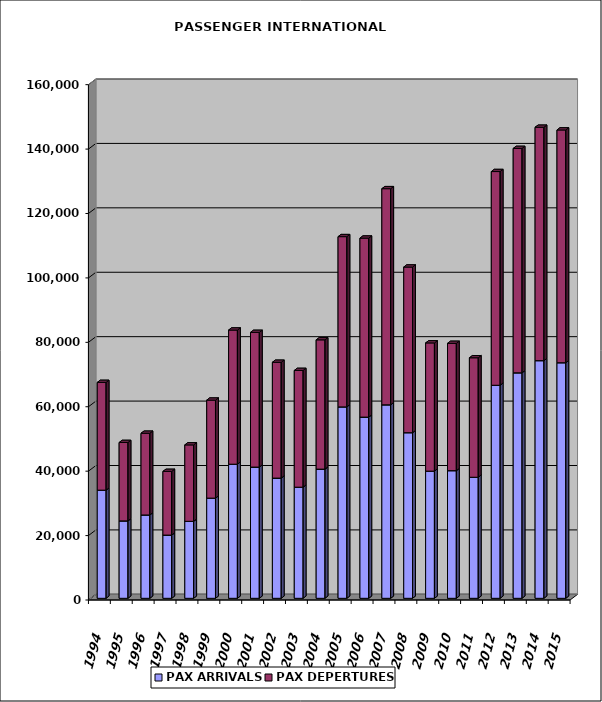
| Category | PAX ARRIVALS | PAX DEPERTURES |
|---|---|---|
| 1994.0 | 33577 | 33453 |
| 1995.0 | 24031 | 24351 |
| 1996.0 | 25874 | 25369 |
| 1997.0 | 19627 | 19773 |
| 1998.0 | 23902 | 23726 |
| 1999.0 | 31098 | 30429 |
| 2000.0 | 41635 | 41647 |
| 2001.0 | 40745 | 41813 |
| 2002.0 | 37317 | 35961 |
| 2003.0 | 34499 | 36246 |
| 2004.0 | 40108 | 40140 |
| 2005.0 | 59432 | 52852 |
| 2006.0 | 56256 | 55579 |
| 2007.0 | 60069 | 67103 |
| 2008.0 | 51417 | 51427 |
| 2009.0 | 39483 | 39808 |
| 2010.0 | 39627 | 39523 |
| 2011.0 | 37583 | 37097 |
| 2012.0 | 66144 | 66353 |
| 2013.0 | 70006 | 69669 |
| 2014.0 | 73786 | 72457 |
| 2015.0 | 73140 | 72270 |